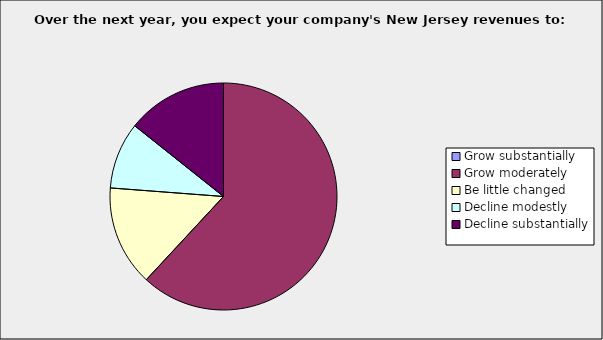
| Category | Series 0 |
|---|---|
| Grow substantially | 0 |
| Grow moderately | 0.619 |
| Be little changed | 0.143 |
| Decline modestly | 0.095 |
| Decline substantially | 0.143 |